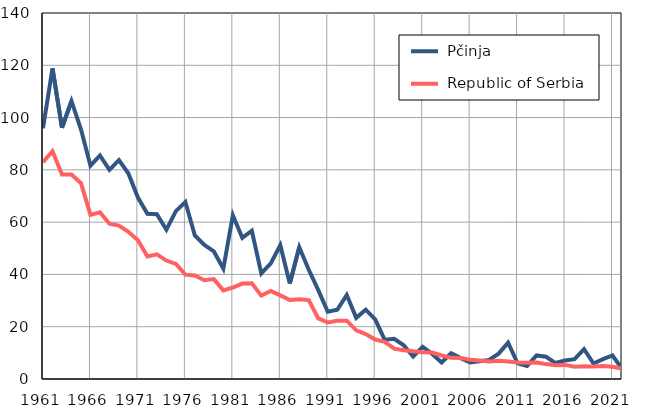
| Category |  Pčinja |  Republic of Serbia |
|---|---|---|
| 1961.0 | 95.9 | 82.9 |
| 1962.0 | 118.8 | 87.1 |
| 1963.0 | 96.1 | 78.2 |
| 1964.0 | 106.3 | 78.2 |
| 1965.0 | 95.5 | 74.9 |
| 1966.0 | 81.6 | 62.8 |
| 1967.0 | 85.5 | 63.8 |
| 1968.0 | 80 | 59.4 |
| 1969.0 | 83.7 | 58.7 |
| 1970.0 | 78.6 | 56.3 |
| 1971.0 | 69.4 | 53.1 |
| 1972.0 | 63.2 | 46.9 |
| 1973.0 | 63 | 47.7 |
| 1974.0 | 57.1 | 45.3 |
| 1975.0 | 64.2 | 44 |
| 1976.0 | 67.7 | 39.9 |
| 1977.0 | 54.9 | 39.6 |
| 1978.0 | 51.3 | 37.8 |
| 1979.0 | 48.8 | 38.2 |
| 1980.0 | 42.2 | 33.9 |
| 1981.0 | 62.6 | 35 |
| 1982.0 | 54 | 36.5 |
| 1983.0 | 56.7 | 36.6 |
| 1984.0 | 40.4 | 31.9 |
| 1985.0 | 44.2 | 33.7 |
| 1986.0 | 51.2 | 32 |
| 1987.0 | 36.5 | 30.2 |
| 1988.0 | 50.4 | 30.5 |
| 1989.0 | 41.8 | 30.2 |
| 1990.0 | 34 | 23.2 |
| 1991.0 | 25.7 | 21.6 |
| 1992.0 | 26.5 | 22.3 |
| 1993.0 | 32.1 | 22.3 |
| 1994.0 | 23.4 | 18.6 |
| 1995.0 | 26.5 | 17.2 |
| 1996.0 | 22.8 | 15.1 |
| 1997.0 | 15 | 14.2 |
| 1998.0 | 15.4 | 11.6 |
| 1999.0 | 12.9 | 11 |
| 2000.0 | 8.6 | 10.6 |
| 2001.0 | 12.3 | 10.2 |
| 2002.0 | 9.6 | 10.1 |
| 2003.0 | 6.3 | 9 |
| 2004.0 | 9.9 | 8.1 |
| 2005.0 | 8 | 8 |
| 2006.0 | 6.3 | 7.4 |
| 2007.0 | 6.8 | 7.1 |
| 2008.0 | 7.3 | 6.7 |
| 2009.0 | 9.7 | 7 |
| 2010.0 | 13.9 | 6.7 |
| 2011.0 | 6 | 6.3 |
| 2012.0 | 5 | 6.2 |
| 2013.0 | 9 | 6.3 |
| 2014.0 | 8.5 | 5.7 |
| 2015.0 | 6.1 | 5.3 |
| 2016.0 | 7.1 | 5.4 |
| 2017.0 | 7.6 | 4.7 |
| 2018.0 | 11.4 | 4.9 |
| 2019.0 | 5.9 | 4.8 |
| 2020.0 | 7.6 | 5 |
| 2021.0 | 9 | 4.7 |
| 2022.0 | 3.9 | 4 |